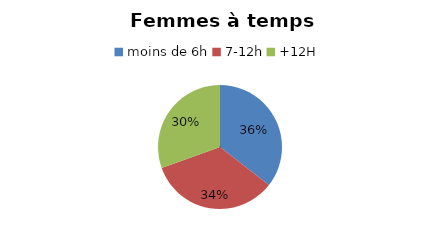
| Category | Femmes temps partiel |
|---|---|
| moins de 6h | 35.53 |
| 7-12h | 33.98 |
| +12H | 30.49 |